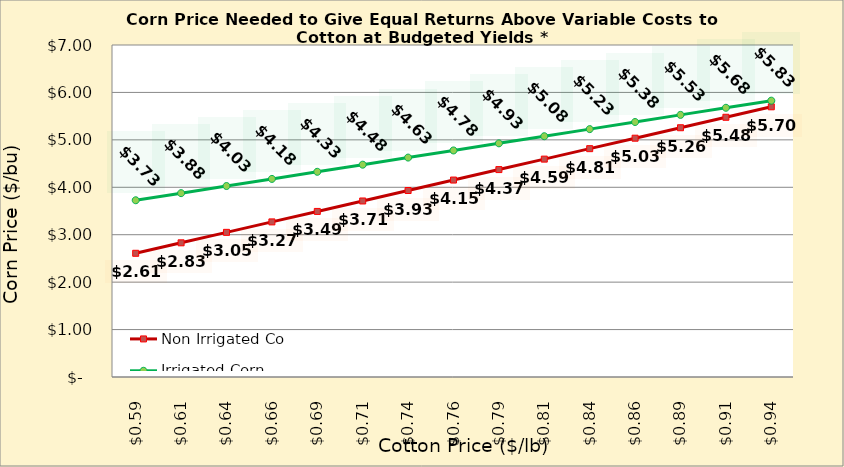
| Category | Non Irrigated Corn | Irrigated Corn |
|---|---|---|
| 0.5849999999999999 | 2.608 | 3.727 |
| 0.6099999999999999 | 2.829 | 3.877 |
| 0.6349999999999999 | 3.05 | 4.027 |
| 0.6599999999999999 | 3.27 | 4.177 |
| 0.6849999999999999 | 3.491 | 4.327 |
| 0.71 | 3.711 | 4.477 |
| 0.735 | 3.932 | 4.627 |
| 0.76 | 4.153 | 4.777 |
| 0.785 | 4.373 | 4.927 |
| 0.81 | 4.594 | 5.077 |
| 0.8350000000000001 | 4.814 | 5.227 |
| 0.8600000000000001 | 5.035 | 5.377 |
| 0.8850000000000001 | 5.256 | 5.527 |
| 0.9100000000000001 | 5.476 | 5.677 |
| 0.9350000000000002 | 5.697 | 5.827 |